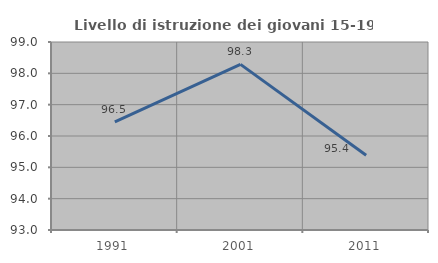
| Category | Livello di istruzione dei giovani 15-19 anni |
|---|---|
| 1991.0 | 96.453 |
| 2001.0 | 98.286 |
| 2011.0 | 95.385 |